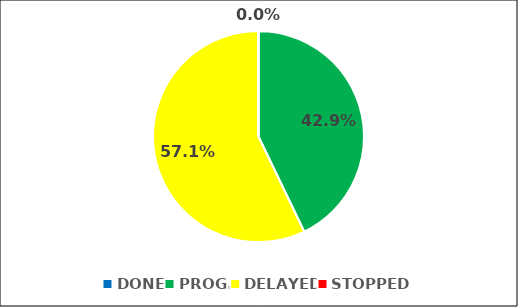
| Category | Series 0 |
|---|---|
| DONE | 0 |
| PROG. | 0.429 |
| DELAYED | 0.571 |
| STOPPED | 0 |